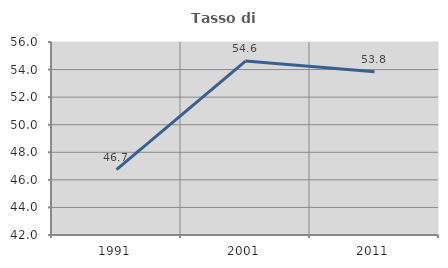
| Category | Tasso di occupazione   |
|---|---|
| 1991.0 | 46.746 |
| 2001.0 | 54.615 |
| 2011.0 | 53.838 |